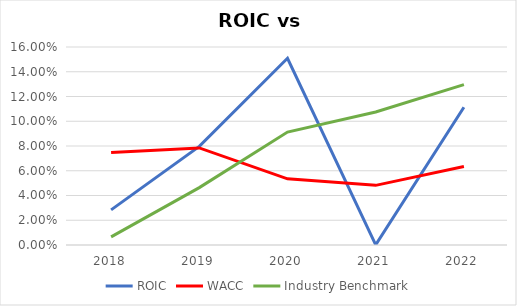
| Category | ROIC | WACC | Industry Benchmark |
|---|---|---|---|
| 2018.0 | 0.028 | 0.075 | 0.007 |
| 2019.0 | 0.08 | 0.078 | 0.046 |
| 2020.0 | 0.151 | 0.053 | 0.091 |
| 2021.0 | 0 | 0.048 | 0.108 |
| 2022.0 | 0.111 | 0.063 | 0.13 |